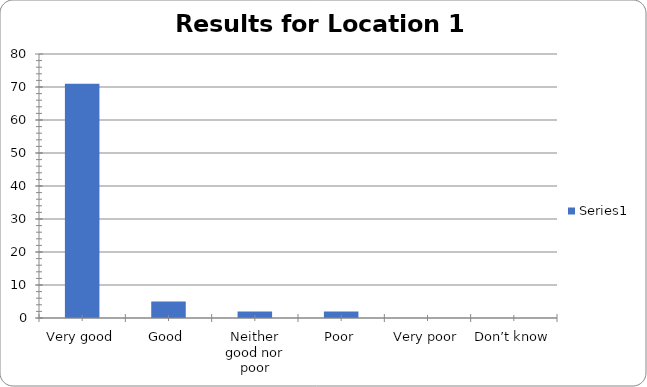
| Category | Series 0 |
|---|---|
| Very good | 71 |
| Good | 5 |
| Neither good nor poor | 2 |
| Poor | 2 |
| Very poor | 0 |
| Don’t know | 0 |